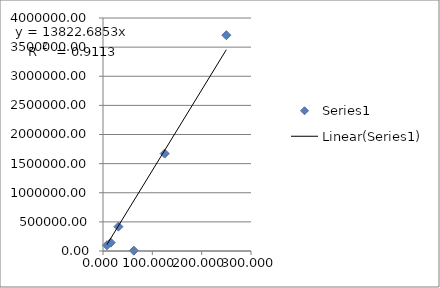
| Category | Series 0 |
|---|---|
| 8.06 | 98730.385 |
| 15.625 | 143174.162 |
| 31.25 | 418224.735 |
| 62.5 | 5969.2 |
| 125.0 | 1671999.777 |
| 250.0 | 3704752.344 |